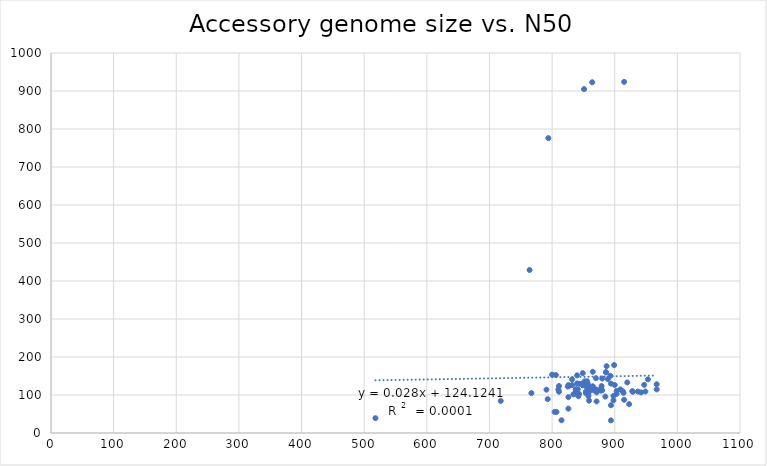
| Category | Series 0 |
|---|---|
| 794.0 | 776 |
| 791.0 | 114 |
| 851.0 | 905 |
| 915.0 | 924 |
| 864.0 | 923 |
| 767.0 | 105.033 |
| 849.0 | 128.496 |
| 920.0 | 133.045 |
| 841.0 | 114.878 |
| 894.0 | 33.308 |
| 826.0 | 94.371 |
| 852.0 | 136.145 |
| 953.0 | 141.166 |
| 800.0 | 153.62 |
| 871.0 | 106.871 |
| 859.0 | 85.127 |
| 839.0 | 109.928 |
| 857.0 | 109.861 |
| 886.0 | 159.967 |
| 849.0 | 125.602 |
| 903.0 | 110.631 |
| 859.0 | 114.49 |
| 838.0 | 111.025 |
| 826.0 | 126.092 |
| 889.0 | 141.984 |
| 827.0 | 123.946 |
| 844.0 | 129.484 |
| 898.0 | 97.707 |
| 909.0 | 114.774 |
| 848.0 | 129.277 |
| 854.0 | 108.62 |
| 870.0 | 114.692 |
| 928.0 | 110.089 |
| 878.0 | 111.602 |
| 879.0 | 123.505 |
| 857.0 | 118.076 |
| 825.0 | 122.297 |
| 838.0 | 114.755 |
| 858.0 | 97.056 |
| 810.0 | 114.787 |
| 880.0 | 143.346 |
| 887.0 | 175.791 |
| 856.0 | 136.011 |
| 861.0 | 120.419 |
| 967.0 | 128.29 |
| 854.0 | 105.02 |
| 886.0 | 159.972 |
| 894.0 | 73.071 |
| 793.0 | 89.18 |
| 855.0 | 121.39 |
| 718.0 | 84.37 |
| 913.0 | 109.804 |
| 863.0 | 113.337 |
| 942.0 | 106.781 |
| 806.0 | 152.564 |
| 880.0 | 112.403 |
| 858.0 | 102.667 |
| 852.0 | 127.506 |
| 893.0 | 150.513 |
| 929.0 | 108.488 |
| 840.0 | 151.706 |
| 832.0 | 126.044 |
| 841.0 | 103.183 |
| 878.0 | 116.42 |
| 832.0 | 141.11 |
| 914.0 | 105.607 |
| 885.0 | 95.821 |
| 900.0 | 126.414 |
| 811.0 | 108.715 |
| 811.0 | 123.635 |
| 967.0 | 114.673 |
| 949.0 | 109.236 |
| 843.0 | 102.857 |
| 842.0 | 96.878 |
| 838.0 | 114.711 |
| 837.0 | 103.767 |
| 865.0 | 122.94 |
| 867.0 | 112.926 |
| 834.0 | 101.785 |
| 903.0 | 102.996 |
| 915.0 | 87.416 |
| 947.0 | 126.679 |
| 871.0 | 83.115 |
| 804.0 | 55.501 |
| 857.0 | 129.343 |
| 870.0 | 144.308 |
| 826.0 | 64.098 |
| 937.0 | 109.124 |
| 764.0 | 429 |
| 807.0 | 55.447 |
| 894.0 | 130.007 |
| 815.0 | 33.426 |
| 849.0 | 126.687 |
| 898.0 | 86.169 |
| 923.0 | 75.94 |
| 899.0 | 178.834 |
| 840.0 | 130.453 |
| 849.0 | 157.5 |
| 865.0 | 161.101 |
| 518.0 | 39 |